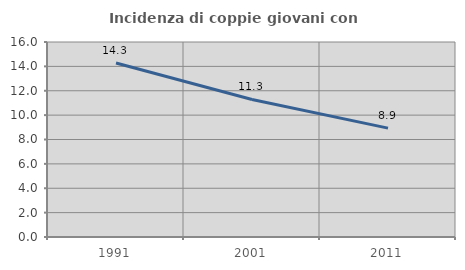
| Category | Incidenza di coppie giovani con figli |
|---|---|
| 1991.0 | 14.274 |
| 2001.0 | 11.285 |
| 2011.0 | 8.935 |